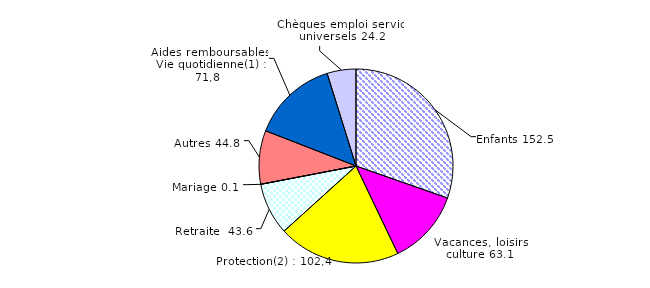
| Category | Series 0 |
|---|---|
| Enfants | 152.503 |
| Vacances, loisirs, culture | 63.059 |
| Protection(2) | 102.425 |
| Retraite  | 43.607 |
| Mariage | 0.083 |
| Autres | 44.825 |
| Aides remboursables  Vie quotidienne(1) | 71.758 |
| Chèques emploi service universels | 24.161 |